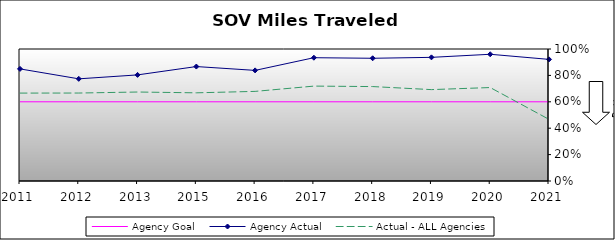
| Category | Agency Goal | Agency Actual | Actual - ALL Agencies |
|---|---|---|---|
| 2011.0 | 0.6 | 0.849 | 0.666 |
| 2012.0 | 0.6 | 0.774 | 0.666 |
| 2013.0 | 0.6 | 0.804 | 0.674 |
| 2015.0 | 0.6 | 0.867 | 0.668 |
| 2016.0 | 0.6 | 0.838 | 0.679 |
| 2017.0 | 0.6 | 0.934 | 0.719 |
| 2018.0 | 0.6 | 0.93 | 0.715 |
| 2019.0 | 0.6 | 0.937 | 0.692 |
| 2020.0 | 0.6 | 0.96 | 0.708 |
| 2021.0 | 0.6 | 0.921 | 0.467 |